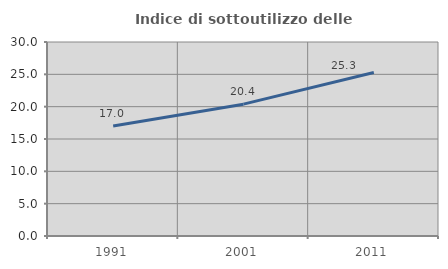
| Category | Indice di sottoutilizzo delle abitazioni  |
|---|---|
| 1991.0 | 17 |
| 2001.0 | 20.388 |
| 2011.0 | 25.275 |